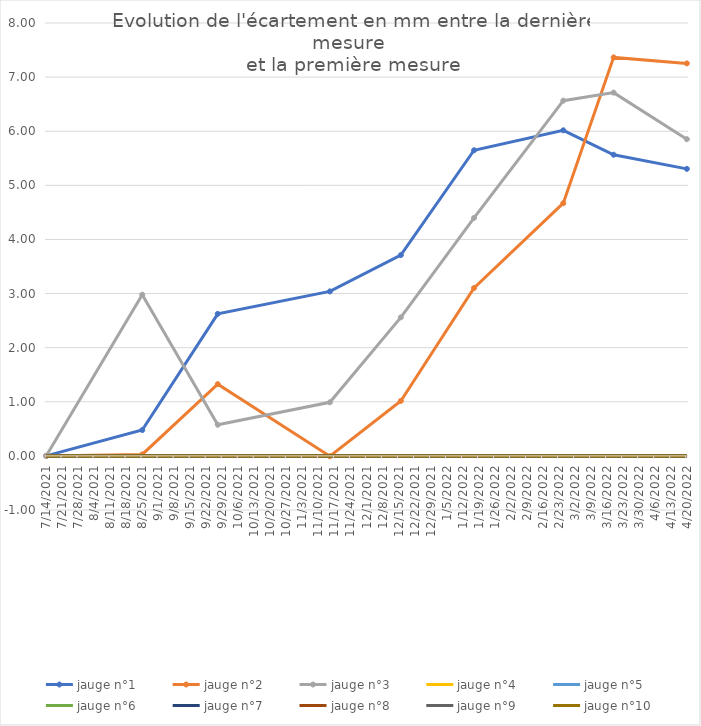
| Category | jauge n°1 | jauge n°2 | jauge n°3 | jauge n°4 | jauge n°5 | jauge n°6 | jauge n°7 | jauge n°8 | jauge n°9 | jauge n°10 |
|---|---|---|---|---|---|---|---|---|---|---|
| 7/14/21 | 0 | 0 | 0 | 0 | 0 | 0 | 0 | 0 | 0 | 0 |
| 8/25/21 | 0.478 | 0.027 | 2.978 | 0 | 0 | 0 | 0 | 0 | 0 | 0 |
| 9/27/21 | 2.625 | 1.326 | 0.575 | 0 | 0 | 0 | 0 | 0 | 0 | 0 |
| 11/15/21 | 3.04 | -0.006 | 0.991 | 0 | 0 | 0 | 0 | 0 | 0 | 0 |
| 12/16/21 | 3.711 | 1.015 | 2.56 | 0 | 0 | 0 | 0 | 0 | 0 | 0 |
| 1/17/22 | 5.648 | 3.103 | 4.398 | 0 | 0 | 0 | 0 | 0 | 0 | 0 |
| 2/25/22 | 6.017 | 4.67 | 6.565 | 0 | 0 | 0 | 0 | 0 | 0 | 0 |
| 3/19/22 | 5.566 | 7.365 | 6.713 | 0 | 0 | 0 | 0 | 0 | 0 | 0 |
| 4/20/22 | 5.304 | 7.253 | 5.853 | 0 | 0 | 0 | 0 | 0 | 0 | 0 |